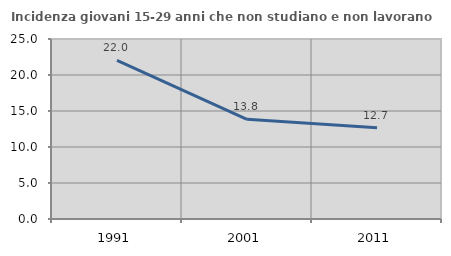
| Category | Incidenza giovani 15-29 anni che non studiano e non lavorano  |
|---|---|
| 1991.0 | 22.028 |
| 2001.0 | 13.846 |
| 2011.0 | 12.676 |